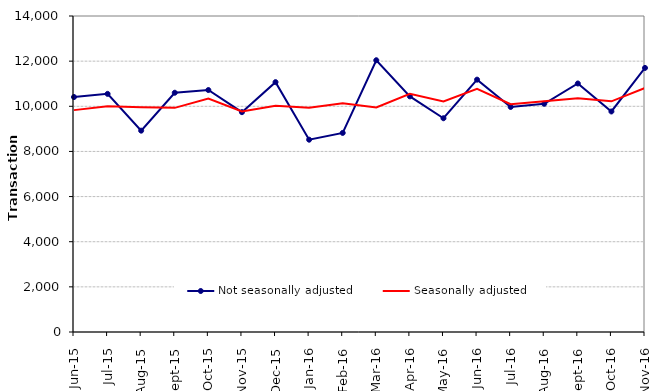
| Category | Not seasonally adjusted | Seasonally adjusted |
|---|---|---|
| 2015-06-01 | 10410 | 9830 |
| 2015-07-01 | 10550 | 10000 |
| 2015-08-01 | 8920 | 9960 |
| 2015-09-01 | 10600 | 9930 |
| 2015-10-01 | 10720 | 10340 |
| 2015-11-01 | 9740 | 9770 |
| 2015-12-01 | 11070 | 10020 |
| 2016-01-01 | 8520 | 9940 |
| 2016-02-01 | 8820 | 10130 |
| 2016-03-01 | 12040 | 9950 |
| 2016-04-01 | 10440 | 10550 |
| 2016-05-01 | 9470 | 10210 |
| 2016-06-01 | 11180 | 10770 |
| 2016-07-01 | 9970 | 10090 |
| 2016-08-01 | 10110 | 10220 |
| 2016-09-01 | 11010 | 10360 |
| 2016-10-01 | 9770 | 10220 |
| 2016-11-01 | 11700 | 10810 |